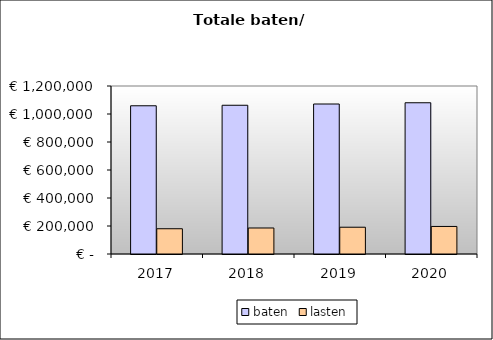
| Category | baten | lasten |
|---|---|---|
| 2017.0 | 1058760.26 | 180384.893 |
| 2018.0 | 1062481.26 | 185774.629 |
| 2019.0 | 1071411.66 | 191279.837 |
| 2020.0 | 1080342.06 | 196851.646 |